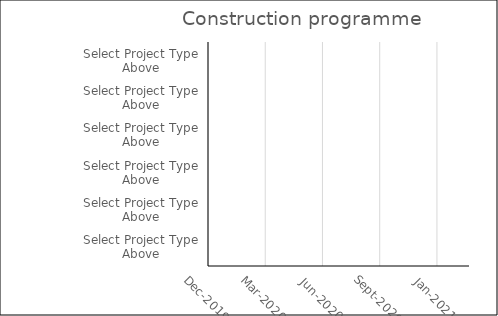
| Category | Start month (mmm/yyyy) | Duration (Number of days) |
|---|---|---|
| Select Project Type Above | 0 | 0 |
| Select Project Type Above | 0 | 0 |
| Select Project Type Above | 0 | 0 |
| Select Project Type Above | 0 | 0 |
| Select Project Type Above | 0 | 0 |
| Select Project Type Above | 0 | 0 |